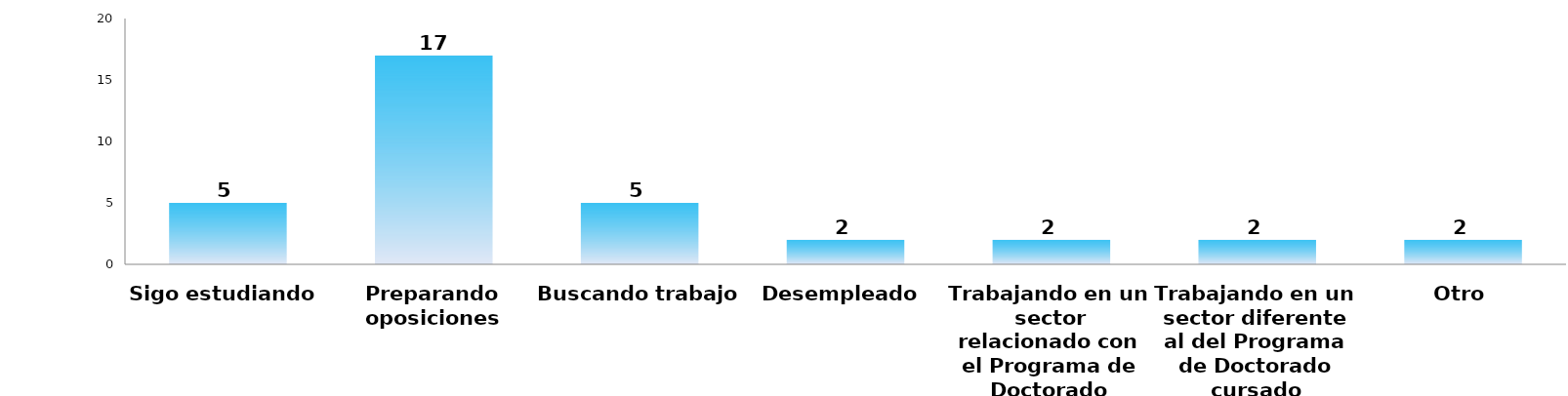
| Category | Series 0 |
|---|---|
| Sigo estudiando | 5 |
| Preparando oposiciones | 17 |
| Buscando trabajo | 5 |
| Desempleado | 2 |
| Trabajando en un sector relacionado con el Programa de Doctorado cursado | 2 |
| Trabajando en un sector diferente al del Programa de Doctorado cursado | 2 |
| Otro | 2 |